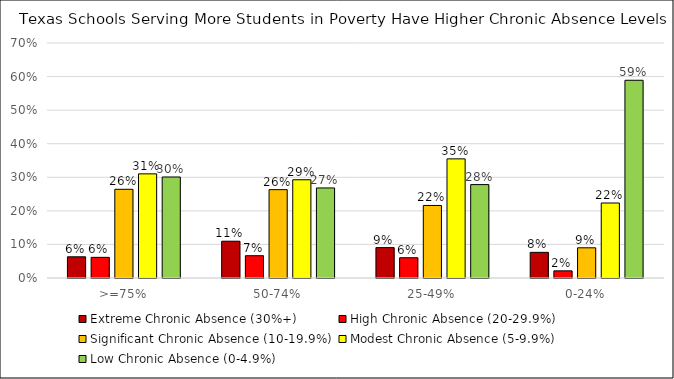
| Category | Extreme Chronic Absence (30%+) | High Chronic Absence (20-29.9%) | Significant Chronic Absence (10-19.9%) | Modest Chronic Absence (5-9.9%) | Low Chronic Absence (0-4.9%) |
|---|---|---|---|---|---|
| >=75% | 0.063 | 0.062 | 0.264 | 0.31 | 0.301 |
| 50-74% | 0.11 | 0.066 | 0.263 | 0.293 | 0.268 |
| 25-49% | 0.091 | 0.06 | 0.216 | 0.355 | 0.278 |
| 0-24% | 0.076 | 0.021 | 0.09 | 0.223 | 0.589 |